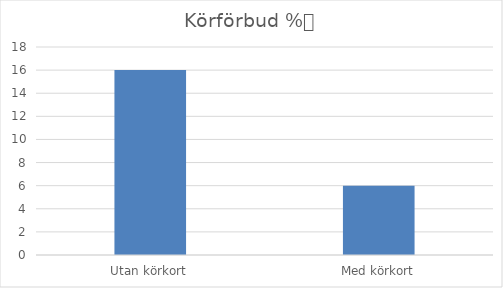
| Category | Andel förare |
|---|---|
| Utan körkort | 16 |
| Med körkort | 6 |